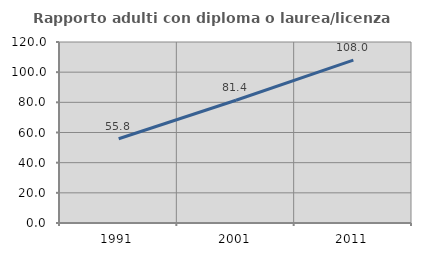
| Category | Rapporto adulti con diploma o laurea/licenza media  |
|---|---|
| 1991.0 | 55.842 |
| 2001.0 | 81.406 |
| 2011.0 | 108.006 |